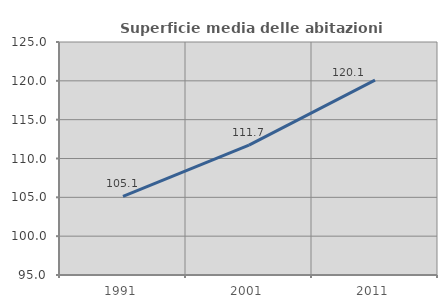
| Category | Superficie media delle abitazioni occupate |
|---|---|
| 1991.0 | 105.128 |
| 2001.0 | 111.729 |
| 2011.0 | 120.097 |